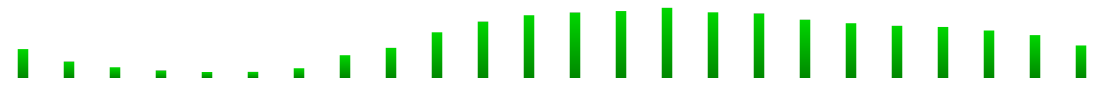
| Category | Series 0 |
|---|---|
| 0 | 0.03 |
| 1 | 0.017 |
| 2 | 0.011 |
| 3 | 0.008 |
| 4 | 0.006 |
| 5 | 0.006 |
| 6 | 0.01 |
| 7 | 0.023 |
| 8 | 0.031 |
| 9 | 0.047 |
| 10 | 0.058 |
| 11 | 0.064 |
| 12 | 0.067 |
| 13 | 0.069 |
| 14 | 0.072 |
| 15 | 0.067 |
| 16 | 0.066 |
| 17 | 0.06 |
| 18 | 0.056 |
| 19 | 0.054 |
| 20 | 0.052 |
| 21 | 0.049 |
| 22 | 0.044 |
| 23 | 0.033 |